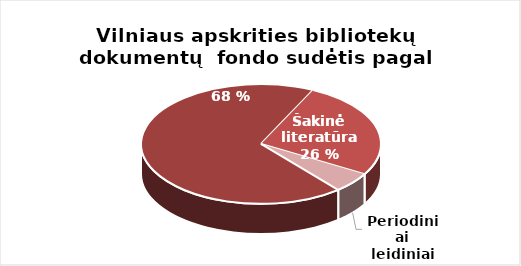
| Category | Series 0 |
|---|---|
| Grožinė literatūra* | 1229221 |
| Šakinė literatūra* | 473192 |
| period. | 97806 |